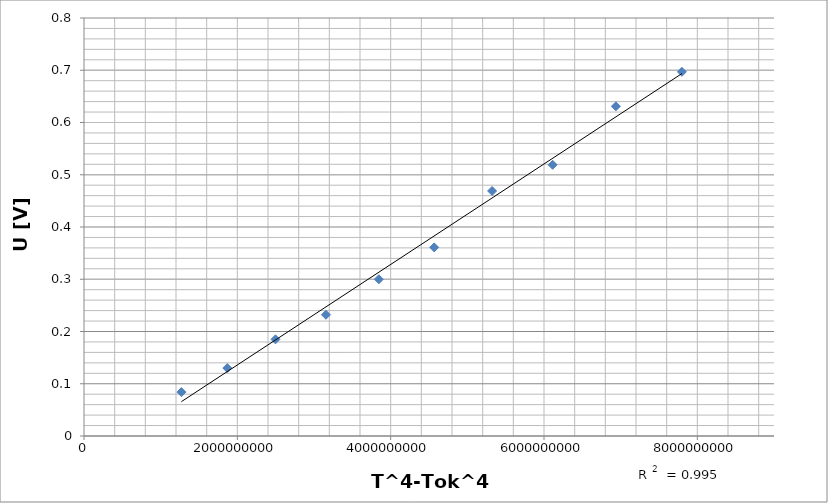
| Category | Series 0 |
|---|---|
| 7798839180.9375 | 0.697 |
| 6937615115.9375 | 0.631 |
| 6112723500.9375 | 0.519 |
| 5323127835.9375 | 0.469 |
| 4567806620.9375 | 0.361 |
| 3845753355.9375 | 0.3 |
| 3155976540.9375 | 0.232 |
| 2497499675.9375 | 0.185 |
| 1869361260.9375 | 0.13 |
| 1270614795.9375 | 0.084 |